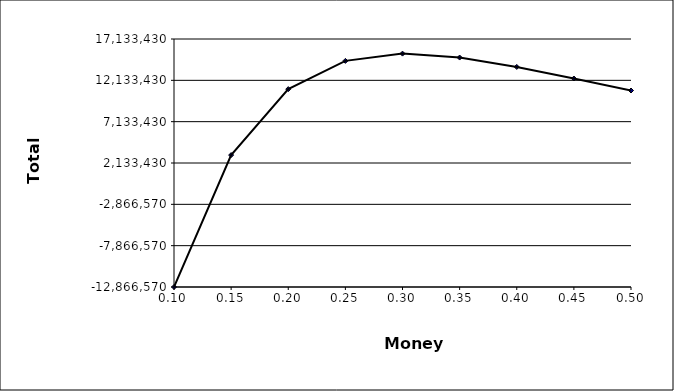
| Category | Total NPV |
|---|---|
| 0.1 | -12866570.405 |
| 0.15 | 3090838.887 |
| 0.2 | 11069890.328 |
| 0.25 | 14487246.507 |
| 0.3 | 15364592.889 |
| 0.35 | 14890390.705 |
| 0.4 | 13755404.301 |
| 0.45 | 12353688.873 |
| 0.5 | 10903215.138 |